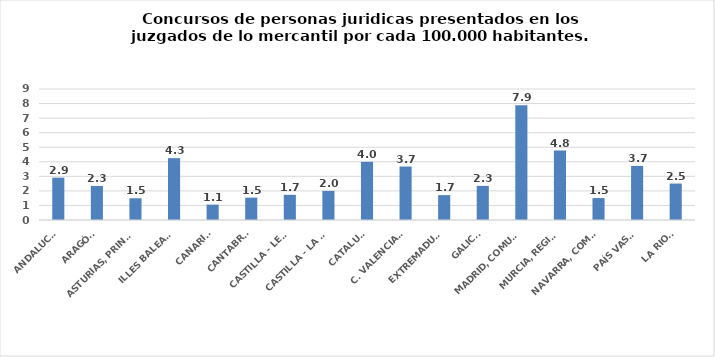
| Category | Series 0 |
|---|---|
| ANDALUCÍA | 2.909 |
| ARAGÓN | 2.339 |
| ASTURIAS, PRINCIPADO | 1.493 |
| ILLES BALEARS | 4.251 |
| CANARIAS | 1.057 |
| CANTABRIA | 1.538 |
| CASTILLA - LEÓN | 1.73 |
| CASTILLA - LA MANCHA | 1.998 |
| CATALUÑA | 3.996 |
| C. VALENCIANA | 3.673 |
| EXTREMADURA | 1.707 |
| GALICIA | 2.343 |
| MADRID, COMUNIDAD | 7.888 |
| MURCIA, REGIÓN | 4.767 |
| NAVARRA, COM. FORAL | 1.507 |
| PAÍS VASCO | 3.715 |
| LA RIOJA | 2.504 |